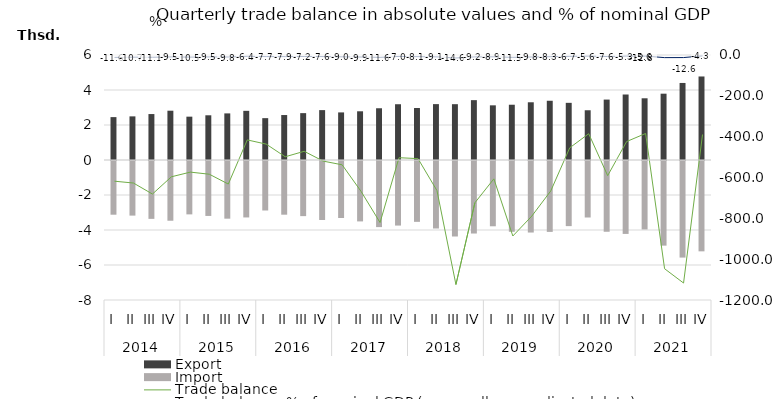
| Category | Export | Import |
|---|---|---|
| 0 | 2450.7 | -3068.8 |
| 1 | 2493.4 | -3120.5 |
| 2 | 2625.5 | -3306.5 |
| 3 | 2816.7 | -3413.2 |
| 4 | 2476.5 | -3050.1 |
| 5 | 2555.2 | -3139.2 |
| 6 | 2663.4 | -3295.5 |
| 7 | 2809.5 | -3225.4 |
| 8 | 2391.5 | -2828.1 |
| 9 | 2569.5 | -3068 |
| 10 | 2678.2 | -3149.9 |
| 11 | 2850.8 | -3370.5 |
| 12 | 2719.6 | -3257.4 |
| 13 | 2783.8 | -3452 |
| 14 | 2956.9 | -3777.4 |
| 15 | 3187 | -3690 |
| 16 | 2969.9 | -3477.4 |
| 17 | 3193.3 | -3857.4 |
| 18 | 3189.7 | -4313.9 |
| 19 | 3420.5 | -4144.2 |
| 20 | 3123.6 | -3730.2 |
| 21 | 3158.2 | -4044.8 |
| 22 | 3298.5 | -4087.5 |
| 23 | 3385.3 | -4051.1 |
| 24 | 3266.4 | -3720.9 |
| 25 | 2842.7 | -3228.3 |
| 26 | 3452.8 | -4043.7 |
| 27 | 3742.7 | -4166.6 |
| 28 | 3526.4 | -3910.9 |
| 29 | 3789.6 | -4836.4 |
| 30 | 4402.4 | -5519.3 |
| 31 | 4772.9 | -5162.3 |